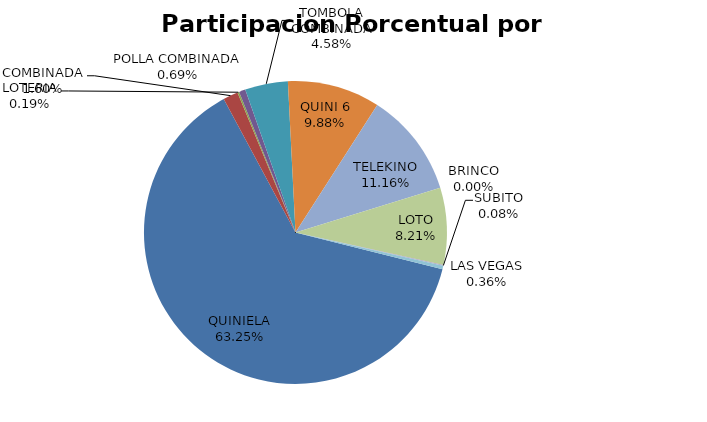
| Category | Series 0 |
|---|---|
| QUINIELA | 2259604 |
| COMBINADA | 57299 |
| LOTERIA | 6593 |
| POLLA COMBINADA | 24526 |
| TOMBOLA COMBINADA | 163640 |
| QUINI 6 | 352781 |
| TELEKINO | 398672 |
| BRINCO | 0 |
| LOTO | 293329 |
| SUBITO | 2984 |
| LAS VEGAS | 12814 |